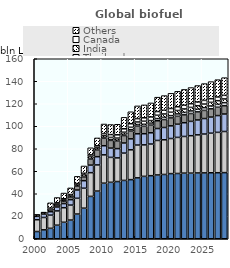
| Category | United States | Brazil | China | European Union | Thailand | India | Canada | Others |
|---|---|---|---|---|---|---|---|---|
| 2000.0 | 6.43 | 10.49 | 2.97 | 0.7 | 0 | 0 | 0.26 | 0.75 |
| 2001.0 | 7.93 | 10.98 | 3 | 0.73 | 0 | 0 | 0.26 | 0.77 |
| 2002.0 | 9.27 | 11.73 | 3.03 | 1.39 | 0.07 | 1.45 | 0.27 | 4.71 |
| 2003.0 | 12.06 | 12.68 | 3.47 | 2.01 | 0.13 | 1.35 | 0.36 | 4.57 |
| 2004.0 | 14.64 | 12.96 | 3.66 | 2.29 | 0.15 | 1.47 | 0.36 | 5.09 |
| 2005.0 | 16.6 | 13.31 | 4.82 | 2.49 | 0.31 | 1.41 | 0.36 | 5.89 |
| 2006.0 | 21.96 | 14 | 7.37 | 3.55 | 0.39 | 1.5 | 0.31 | 6.37 |
| 2007.0 | 27.17 | 17.75 | 6.68 | 3.51 | 0.33 | 1.68 | 1.09 | 6.48 |
| 2008.0 | 37.64 | 21.1 | 6.7 | 5.43 | 0.48 | 1.75 | 1.46 | 6.3 |
| 2009.0 | 42.37 | 23.25 | 7.33 | 5.99 | 0.64 | 1.45 | 1.6 | 6.99 |
| 2010.0 | 49.4 | 25.18 | 8.1 | 6.65 | 0.65 | 1.66 | 1.87 | 8.48 |
| 2011.0 | 50.18 | 22.15 | 8.25 | 6.86 | 0.68 | 1.94 | 2.53 | 8.95 |
| 2012.0 | 50.86 | 21.01 | 8.25 | 6.79 | 0.7 | 1.85 | 2.94 | 9.39 |
| 2013.0 | 51.85 | 24.28 | 8.99 | 6.61 | 1.13 | 1.84 | 3.04 | 10.17 |
| 2014.0 | 52.55 | 26.51 | 9.75 | 6.74 | 1.39 | 2.14 | 3.16 | 10.64 |
| 2015.0 | 54.13 | 29.15 | 10 | 6.73 | 1.52 | 2.26 | 3.02 | 11.28 |
| 2016.0 | 55.47 | 27.98 | 9.9 | 6.6 | 1.78 | 2.74 | 3.05 | 11.46 |
| 2017.0 | 56.06 | 28.13 | 10 | 6.82 | 1.72 | 2.32 | 3.22 | 12.46 |
| 2018.0 | 56.7 | 30.68 | 10.6 | 6.9 | 1.92 | 2.97 | 3.32 | 12.77 |
| 2019.0 | 57.14 | 30.84 | 10.92 | 7.05 | 1.98 | 2.98 | 3.32 | 13.02 |
| 2020.0 | 57.91 | 31.2 | 11.25 | 7.04 | 2.05 | 3.01 | 3.34 | 13.46 |
| 2021.0 | 58.02 | 32.07 | 11.72 | 7.04 | 2.12 | 3.04 | 3.34 | 13.7 |
| 2022.0 | 58.33 | 32.59 | 12.21 | 6.99 | 2.19 | 3.07 | 3.33 | 14.02 |
| 2023.0 | 58.32 | 33.29 | 12.71 | 7.04 | 2.27 | 3.11 | 3.31 | 14.33 |
| 2024.0 | 58.5 | 33.85 | 13.24 | 7.19 | 2.35 | 3.14 | 3.3 | 14.62 |
| 2025.0 | 58.54 | 34.53 | 13.78 | 7.26 | 2.43 | 3.18 | 3.28 | 14.9 |
| 2026.0 | 58.66 | 35.18 | 14.34 | 7.33 | 2.52 | 3.22 | 3.26 | 15.15 |
| 2027.0 | 58.7 | 35.88 | 14.92 | 7.38 | 2.6 | 3.25 | 3.25 | 15.43 |
| 2028.0 | 58.78 | 36.56 | 15.53 | 7.41 | 2.7 | 3.29 | 3.23 | 15.69 |